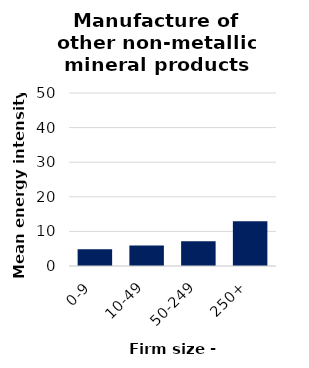
| Category | Manufacture of other non-metallic mineral products |
|---|---|
| 0-9 | 4.833 |
| 10-49 | 5.949 |
| 50-249 | 7.134 |
| 250+ | 12.921 |